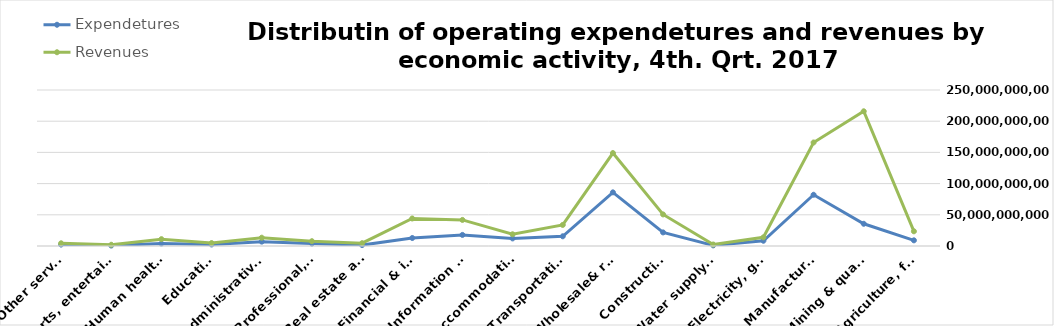
| Category | Expendetures | Revenues |
|---|---|---|
| Agriculture, forestry & fishing | 9080511234 | 23548871433 |
| Mining & quarrying | 35606743172 | 215876093298 |
| Manufacturing | 82101223476 | 165908622223 |
| Electricity, gas, steam & air conditioning supply | 8412008399 | 13921667124 |
| Water supply; sewerage, waste remediation  | 999072347 | 2388098372 |
| Construction | 21777068219 | 50600874329 |
| Wholesale& retail trade; repair of motor vehicles | 85961212324 | 148965403456 |
| Transportation& storage | 15565500128 | 33768769422 |
| Accommodation & food service activities | 12153576223 | 18787987318 |
| Information & communication | 17757443478 | 41780112116 |
| Financial & insurance | 12809765451 | 44098709147 |
| Real estate activities | 1442338349 | 4477659326 |
| Professional, scientific & technical activities | 3866765214 | 7687533286 |
| Administrative and support service activities | 6980007178 | 13298090279 |
| Education | 2418871231 | 4708765321 |
| Human health and &l work activities | 3971010484 | 10978095369 |
| Arts, entertainment & recreation | 701234411 | 1988760223 |
| Other service | 2224121342 | 4333656236 |